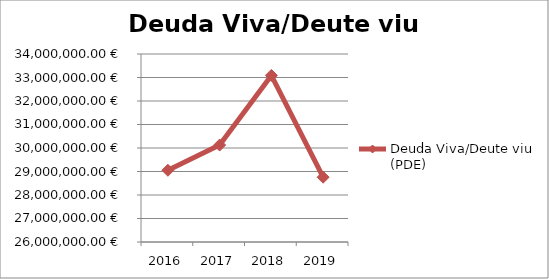
| Category | Deuda Viva/Deute viu (PDE) |
|---|---|
| 2016 | 29052571.71 |
| 2017 | 30124274.71 |
| 2018 | 33089342.59 |
| 2019 | 28756845.84 |